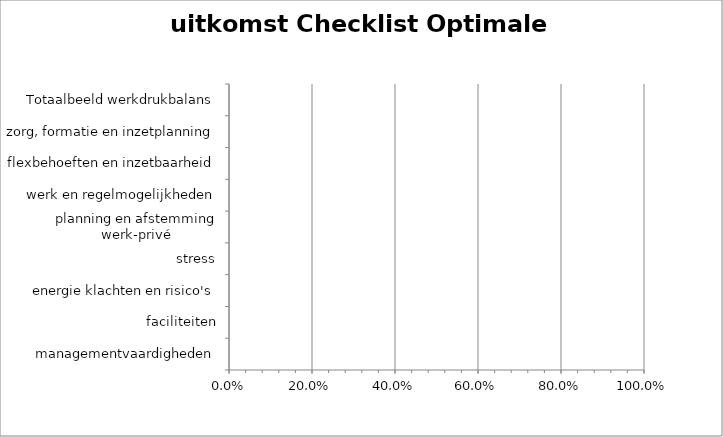
| Category | Uitkomst Checklist                             Optimale Condities |
|---|---|
| Totaalbeeld werkdrukbalans | 0 |
| zorg, formatie en inzetplanning | 0 |
| flexbehoeften en inzetbaarheid | 0 |
| werk en regelmogelijkheden | 0 |
| planning en afstemming werk-privé | 0 |
| stress | 0 |
| energie klachten en risico's | 0 |
| faciliteiten | 0 |
| managementvaardigheden | 0 |